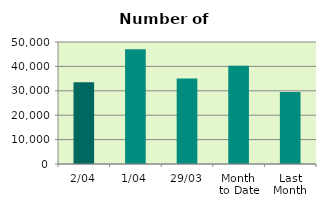
| Category | Series 0 |
|---|---|
| 2/04 | 33526 |
| 1/04 | 46982 |
| 29/03 | 35072 |
| Month 
to Date | 40254 |
| Last
Month | 29553.143 |